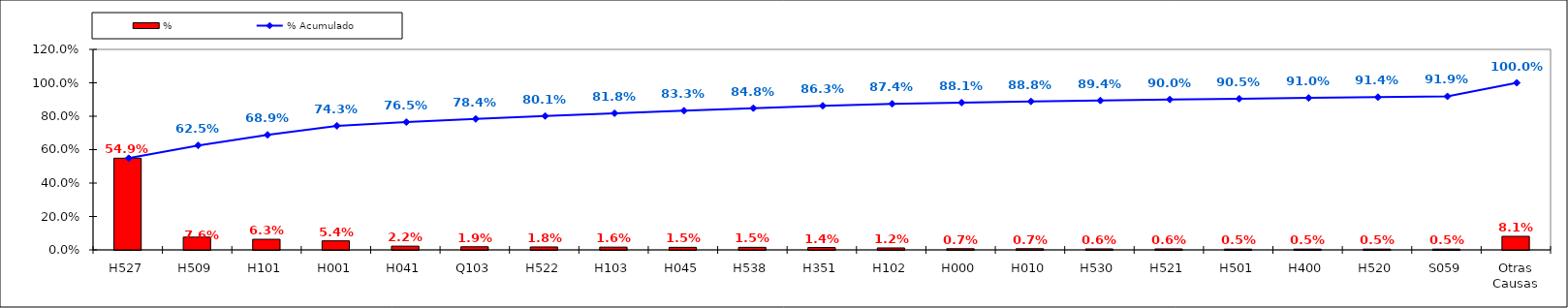
| Category | % |
|---|---|
| H527 | 0.549 |
| H509 | 0.076 |
| H101 | 0.063 |
| H001 | 0.054 |
| H041 | 0.022 |
| Q103 | 0.019 |
| H522 | 0.018 |
| H103 | 0.016 |
| H045 | 0.015 |
| H538 | 0.015 |
| H351 | 0.014 |
| H102 | 0.012 |
| H000 | 0.007 |
| H010 | 0.007 |
| H530 | 0.006 |
| H521 | 0.006 |
| H501 | 0.005 |
| H400 | 0.005 |
| H520 | 0.005 |
| S059 | 0.005 |
| Otras Causas | 0.081 |